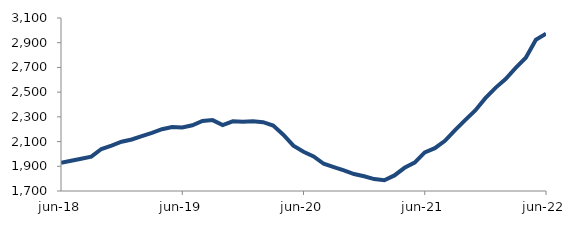
| Category | Series 0 |
|---|---|
| 2018-06-01 | 1927.991 |
| 2018-07-01 | 1944.508 |
| 2018-08-01 | 1961.029 |
| 2018-09-01 | 1978.317 |
| 2018-10-01 | 2039.821 |
| 2018-11-01 | 2068.002 |
| 2018-12-01 | 2098.706 |
| 2019-01-01 | 2116.727 |
| 2019-02-01 | 2144.876 |
| 2019-03-01 | 2171.077 |
| 2019-04-01 | 2199.941 |
| 2019-05-01 | 2218.125 |
| 2019-06-01 | 2213.708 |
| 2019-07-01 | 2231.834 |
| 2019-08-01 | 2267.321 |
| 2019-09-01 | 2273.768 |
| 2019-10-01 | 2233.304 |
| 2019-11-01 | 2263.898 |
| 2019-12-01 | 2259.926 |
| 2020-01-01 | 2265.053 |
| 2020-02-01 | 2256.766 |
| 2020-03-01 | 2229.161 |
| 2020-04-01 | 2155.791 |
| 2020-05-01 | 2066.843 |
| 2020-06-01 | 2018.026 |
| 2020-07-01 | 1979.558 |
| 2020-08-01 | 1920.368 |
| 2020-09-01 | 1893.237 |
| 2020-10-01 | 1867.4 |
| 2020-11-01 | 1837.195 |
| 2020-12-01 | 1819.546 |
| 2021-01-01 | 1796.45 |
| 2021-02-01 | 1786.603 |
| 2021-03-01 | 1826.072 |
| 2021-04-01 | 1887.798 |
| 2021-05-01 | 1930.372 |
| 2021-06-01 | 2012.926 |
| 2021-07-01 | 2046.434 |
| 2021-08-01 | 2105.806 |
| 2021-09-01 | 2192.514 |
| 2021-10-01 | 2272.972 |
| 2021-11-01 | 2351.334 |
| 2021-12-01 | 2451.171 |
| 2022-01-01 | 2534.613 |
| 2022-02-01 | 2606.357 |
| 2022-03-01 | 2696.948 |
| 2022-04-01 | 2778.264 |
| 2022-05-01 | 2924.682 |
| 2022-06-01 | 2972.281 |